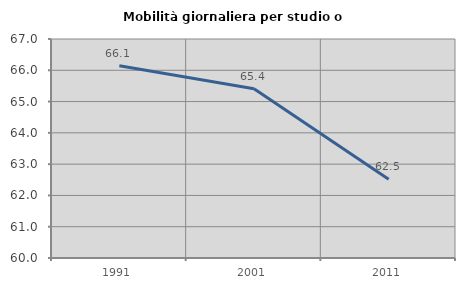
| Category | Mobilità giornaliera per studio o lavoro |
|---|---|
| 1991.0 | 66.142 |
| 2001.0 | 65.412 |
| 2011.0 | 62.519 |